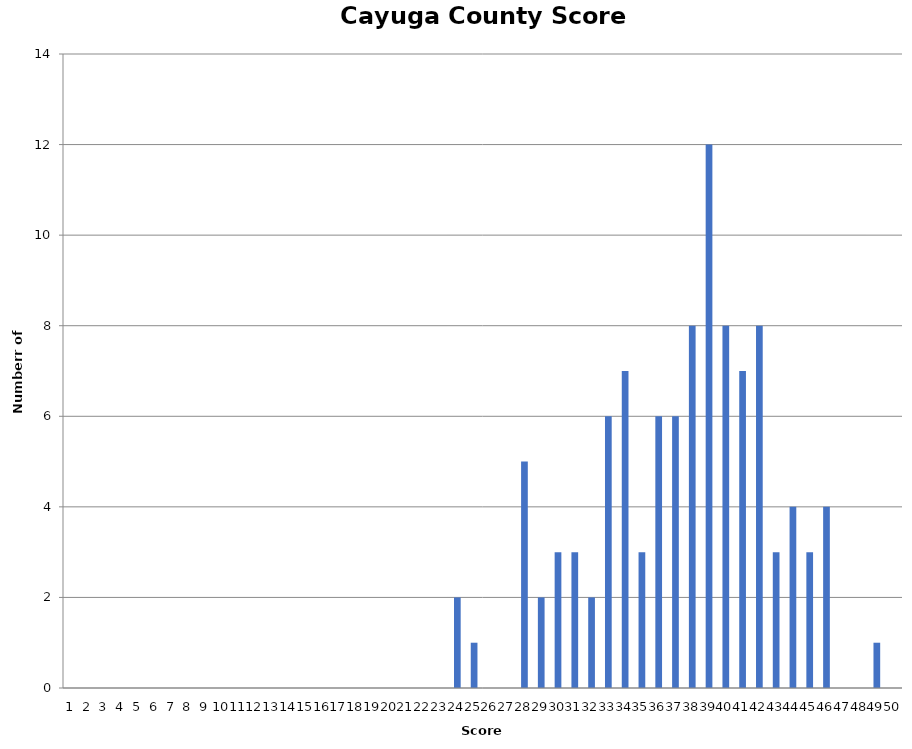
| Category | CC |
|---|---|
| 0 | 0 |
| 1 | 0 |
| 2 | 0 |
| 3 | 0 |
| 4 | 0 |
| 5 | 0 |
| 6 | 0 |
| 7 | 0 |
| 8 | 0 |
| 9 | 0 |
| 10 | 0 |
| 11 | 0 |
| 12 | 0 |
| 13 | 0 |
| 14 | 0 |
| 15 | 0 |
| 16 | 0 |
| 17 | 0 |
| 18 | 0 |
| 19 | 0 |
| 20 | 0 |
| 21 | 0 |
| 22 | 0 |
| 23 | 2 |
| 24 | 1 |
| 25 | 0 |
| 26 | 0 |
| 27 | 5 |
| 28 | 2 |
| 29 | 3 |
| 30 | 3 |
| 31 | 2 |
| 32 | 6 |
| 33 | 7 |
| 34 | 3 |
| 35 | 6 |
| 36 | 6 |
| 37 | 8 |
| 38 | 12 |
| 39 | 8 |
| 40 | 7 |
| 41 | 8 |
| 42 | 3 |
| 43 | 4 |
| 44 | 3 |
| 45 | 4 |
| 46 | 0 |
| 47 | 0 |
| 48 | 1 |
| 49 | 0 |